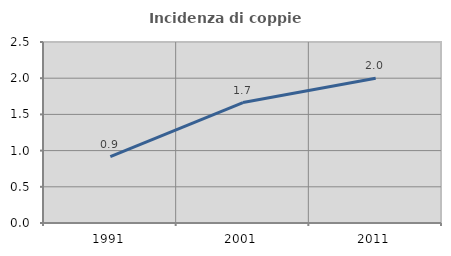
| Category | Incidenza di coppie miste |
|---|---|
| 1991.0 | 0.916 |
| 2001.0 | 1.664 |
| 2011.0 | 2 |